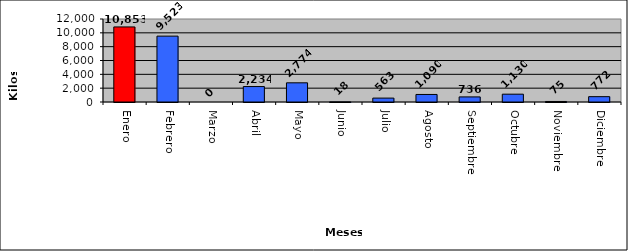
| Category | Series 0 |
|---|---|
| Enero | 10853 |
| Febrero | 9523 |
| Marzo | 0 |
| Abril | 2234 |
| Mayo | 2774 |
| Junio | 18 |
| Julio | 563 |
| Agosto | 1090 |
| Septiembre | 736 |
| Octubre | 1130 |
| Noviembre | 75 |
| Diciembre | 772 |